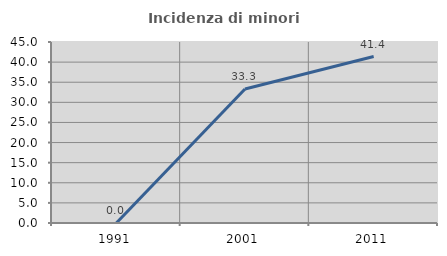
| Category | Incidenza di minori stranieri |
|---|---|
| 1991.0 | 0 |
| 2001.0 | 33.333 |
| 2011.0 | 41.379 |